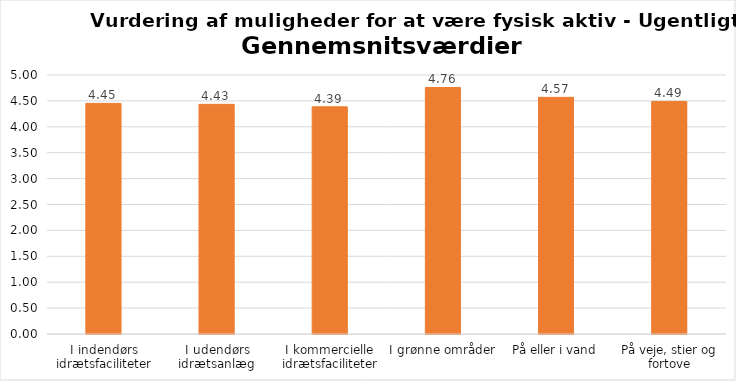
| Category | Gennemsnit |
|---|---|
| I indendørs idrætsfaciliteter | 4.452 |
| I udendørs idrætsanlæg | 4.434 |
| I kommercielle idrætsfaciliteter | 4.386 |
| I grønne områder | 4.759 |
| På eller i vand | 4.569 |
| På veje, stier og fortove | 4.49 |